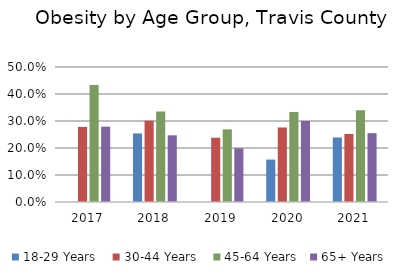
| Category | 18-29 Years  | 30-44 Years  | 45-64 Years | 65+ Years  |
|---|---|---|---|---|
| 2017.0 | 0 | 0.278 | 0.433 | 0.279 |
| 2018.0 | 0.254 | 0.301 | 0.335 | 0.247 |
| 2019.0 | 0 | 0.238 | 0.269 | 0.199 |
| 2020.0 | 0.157 | 0.276 | 0.333 | 0.3 |
| 2021.0 | 0.239 | 0.252 | 0.34 | 0.255 |